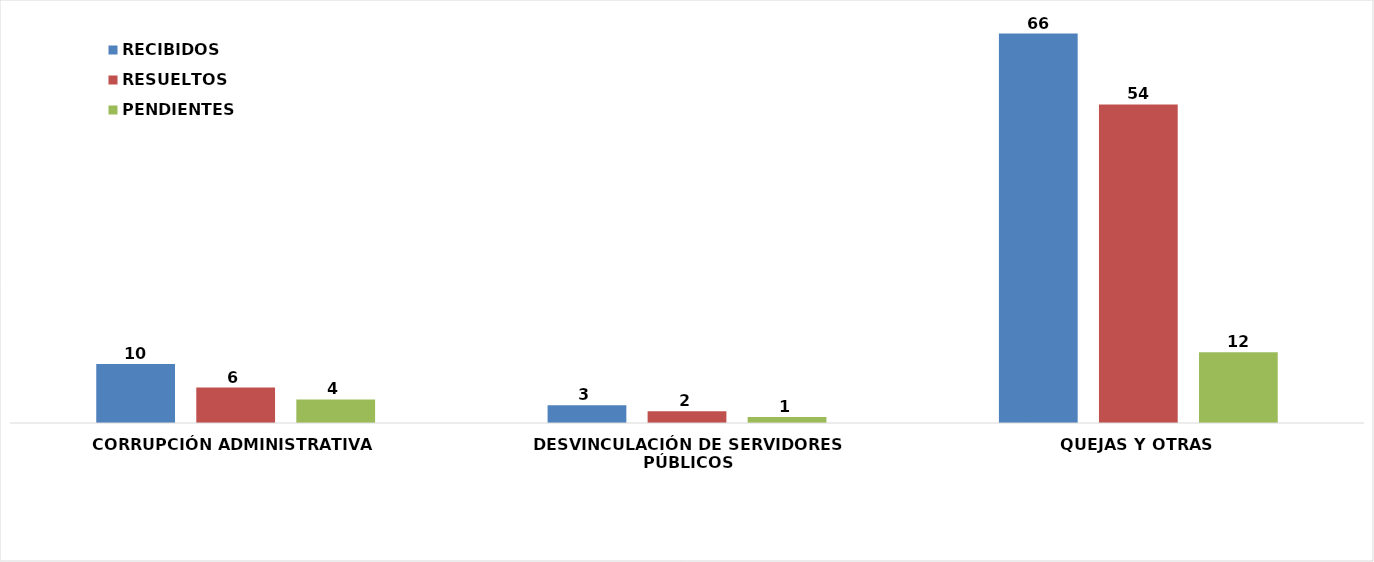
| Category | RECIBIDOS | RESUELTOS  | PENDIENTES |
|---|---|---|---|
| CORRUPCIÓN ADMINISTRATIVA | 10 | 6 | 4 |
| DESVINCULACIÓN DE SERVIDORES PÚBLICOS | 3 | 2 | 1 |
| QUEJAS Y OTRAS | 66 | 54 | 12 |